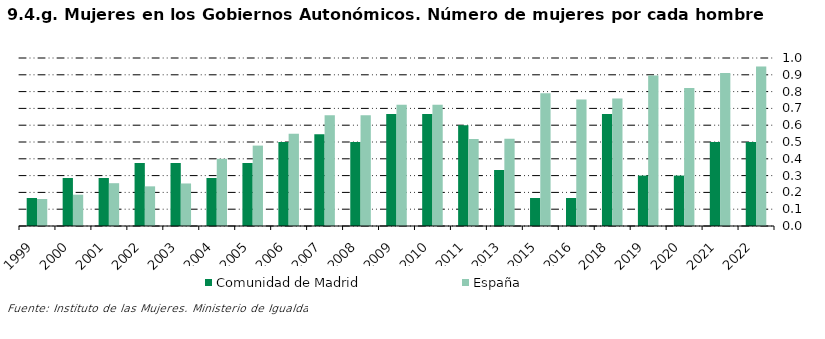
| Category | Comunidad de Madrid | España |
|---|---|---|
| 1999.0 | 0.167 | 0.161 |
| 2000.0 | 0.286 | 0.186 |
| 2001.0 | 0.286 | 0.255 |
| 2002.0 | 0.375 | 0.236 |
| 2003.0 | 0.375 | 0.253 |
| 2004.0 | 0.286 | 0.4 |
| 2005.0 | 0.375 | 0.479 |
| 2006.0 | 0.5 | 0.549 |
| 2007.0 | 0.545 | 0.659 |
| 2008.0 | 0.5 | 0.659 |
| 2009.0 | 0.667 | 0.722 |
| 2010.0 | 0.667 | 0.722 |
| 2011.0 | 0.6 | 0.518 |
| 2013.0 | 0.333 | 0.519 |
| 2015.0 | 0.167 | 0.789 |
| 2016.0 | 0.167 | 0.752 |
| 2018.0 | 0.667 | 0.76 |
| 2019.0 | 0.3 | 0.895 |
| 2020.0 | 0.3 | 0.821 |
| 2021.0 | 0.5 | 0.911 |
| 2022.0 | 0.5 | 0.949 |